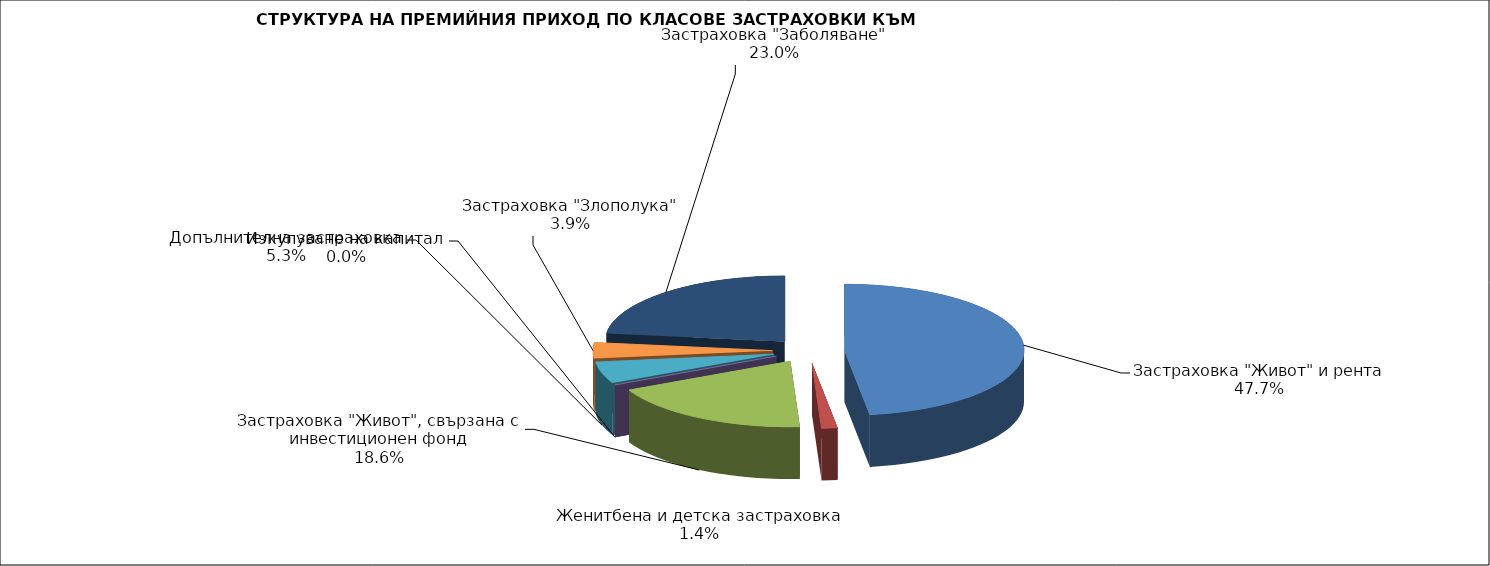
| Category | Series 0 |
|---|---|
| Застраховка "Живот" и рента | 147976062.747 |
| Женитбена и детска застраховка | 4416030.47 |
| Застраховка "Живот", свързана с инвестиционен фонд | 57627185.554 |
| Изкупуване на капитал | 0 |
| Допълнителна застраховка | 16528016.816 |
| Застраховка "Злополука" | 12080457.831 |
| Застраховка "Заболяване" | 71389782.86 |